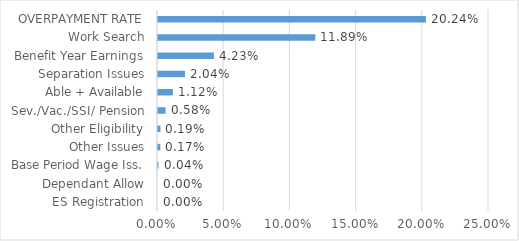
| Category | Series 0 |
|---|---|
| ES Registration | 0 |
| Dependant Allow | 0 |
| Base Period Wage Iss. | 0 |
| Other Issues | 0.002 |
| Other Eligibility | 0.002 |
| Sev./Vac./SSI/ Pension | 0.006 |
| Able + Available | 0.011 |
| Separation Issues | 0.02 |
| Benefit Year Earnings | 0.042 |
| Work Search | 0.119 |
| OVERPAYMENT RATE | 0.202 |